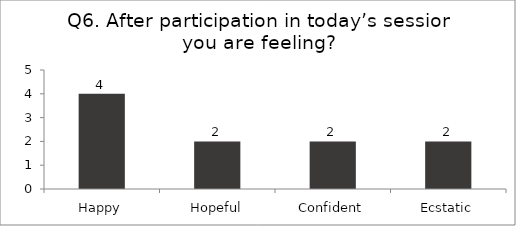
| Category | Q6. After participation in today’s session you are feeling? |
|---|---|
| Happy | 4 |
| Hopeful | 2 |
| Confident | 2 |
| Ecstatic | 2 |